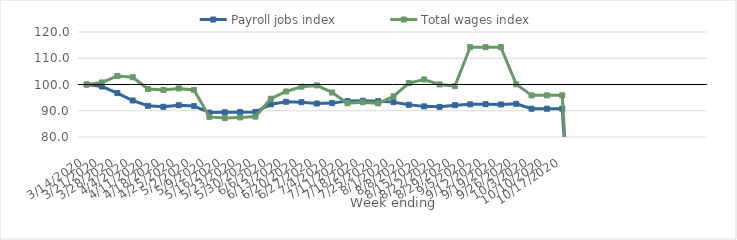
| Category | Payroll jobs index | Total wages index |
|---|---|---|
| 14/03/2020 | 100 | 100 |
| 21/03/2020 | 99.228 | 100.793 |
| 28/03/2020 | 96.719 | 103.267 |
| 04/04/2020 | 93.906 | 102.771 |
| 11/04/2020 | 91.873 | 98.293 |
| 18/04/2020 | 91.504 | 97.927 |
| 25/04/2020 | 92.102 | 98.504 |
| 02/05/2020 | 91.773 | 97.924 |
| 09/05/2020 | 89.294 | 87.652 |
| 16/05/2020 | 89.407 | 87.206 |
| 23/05/2020 | 89.453 | 87.451 |
| 30/05/2020 | 89.54 | 87.778 |
| 06/06/2020 | 92.457 | 94.586 |
| 13/06/2020 | 93.421 | 97.35 |
| 20/06/2020 | 93.271 | 99.157 |
| 27/06/2020 | 92.748 | 99.657 |
| 04/07/2020 | 92.905 | 96.951 |
| 11/07/2020 | 93.674 | 92.854 |
| 18/07/2020 | 93.811 | 93.212 |
| 25/07/2020 | 93.637 | 92.787 |
| 01/08/2020 | 93.286 | 95.48 |
| 08/08/2020 | 92.284 | 100.509 |
| 15/08/2020 | 91.669 | 101.922 |
| 22/08/2020 | 91.482 | 100.021 |
| 29/08/2020 | 92.114 | 99.394 |
| 05/09/2020 | 92.436 | 114.236 |
| 12/09/2020 | 92.512 | 114.234 |
| 19/09/2020 | 92.396 | 114.231 |
| 26/09/2020 | 92.646 | 100.087 |
| 03/10/2020 | 90.779 | 95.864 |
| 10/10/2020 | 90.779 | 95.864 |
| 17/10/2020 | 90.779 | 95.864 |